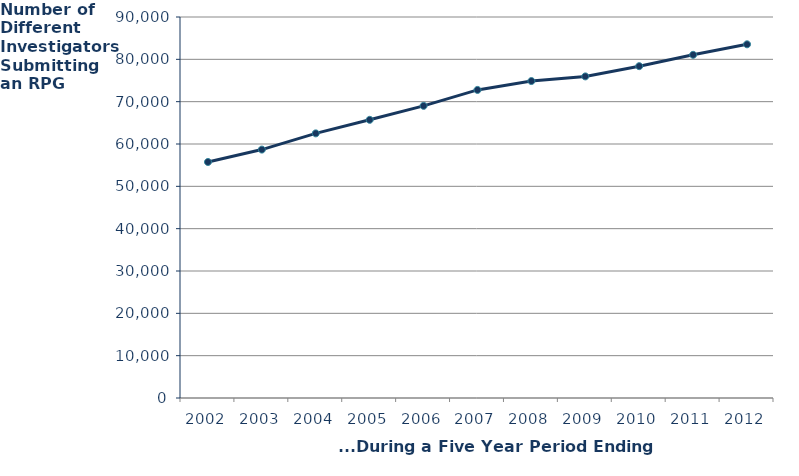
| Category | PIs |
|---|---|
| 2002.0 | 55750 |
| 2003.0 | 58681 |
| 2004.0 | 62509 |
| 2005.0 | 65710 |
| 2006.0 | 69011 |
| 2007.0 | 72773 |
| 2008.0 | 74872 |
| 2009.0 | 75969 |
| 2010.0 | 78386 |
| 2011.0 | 81066 |
| 2012.0 | 83546 |